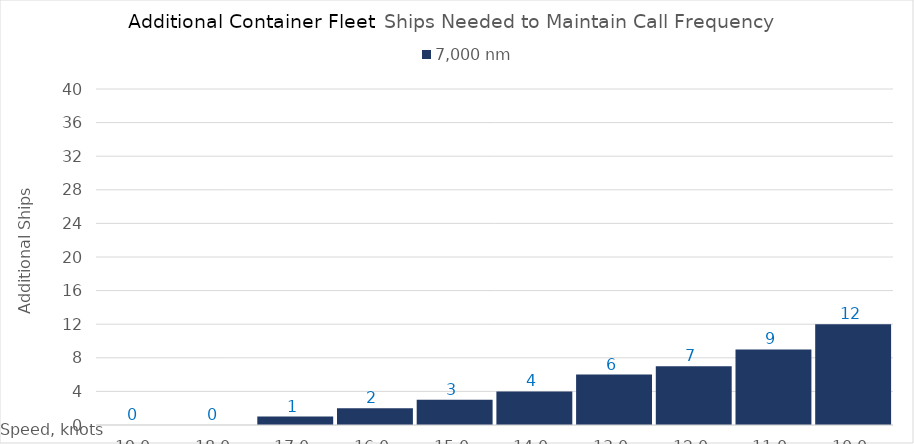
| Category | 7,000 |
|---|---|
| 19.0 | 0 |
| 18.0 | 0 |
| 17.0 | 1 |
| 16.0 | 2 |
| 15.0 | 3 |
| 14.0 | 4 |
| 13.0 | 6 |
| 12.0 | 7 |
| 11.0 | 9 |
| 10.0 | 12 |